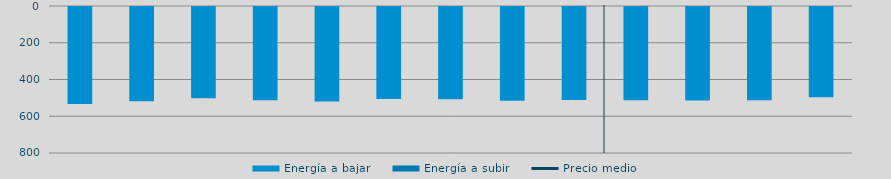
| Category | Energía a bajar | Energía a subir |
|---|---|---|
| 0 | 527.758 |  |
| 1 | 513.52 |  |
| 2 | 497.172 |  |
| 3 | 507.87 |  |
| 4 | 514.171 |  |
| 5 | 501.31 |  |
| 6 | 501.713 |  |
| 7 | 510.776 |  |
| 8 | 505.54 |  |
| 9 | 508.149 |  |
| 10 | 509.307 |  |
| 11 | 507.622 |  |
| 12 | 491.087 |  |